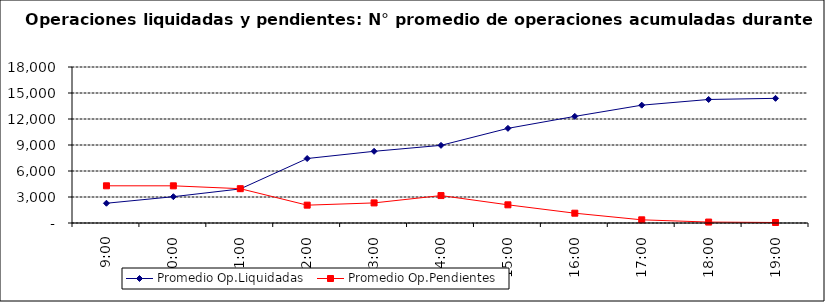
| Category | Promedio Op.Liquidadas | Promedio Op.Pendientes |
|---|---|---|
| 0.375 | 2279.284 | 4292.296 |
| 0.4166666666666667 | 3035.238 | 4290.81 |
| 0.4583333333333333 | 3930.762 | 3960 |
| 0.5 | 7438.952 | 2058.667 |
| 0.5416666666666666 | 8272.476 | 2316.714 |
| 0.5833333333333334 | 8959.19 | 3165.524 |
| 0.625 | 10921.571 | 2097.286 |
| 0.6666666666666666 | 12302.381 | 1130.905 |
| 0.7083333333333334 | 13594.952 | 367.286 |
| 0.75 | 14253.429 | 106.714 |
| 0.7916666666666666 | 14384.19 | 58.095 |